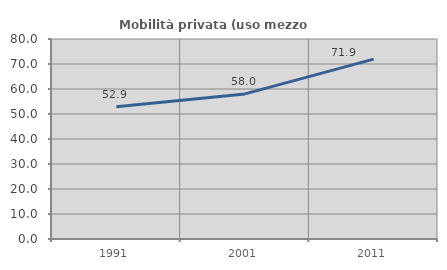
| Category | Mobilità privata (uso mezzo privato) |
|---|---|
| 1991.0 | 52.941 |
| 2001.0 | 58.042 |
| 2011.0 | 71.93 |